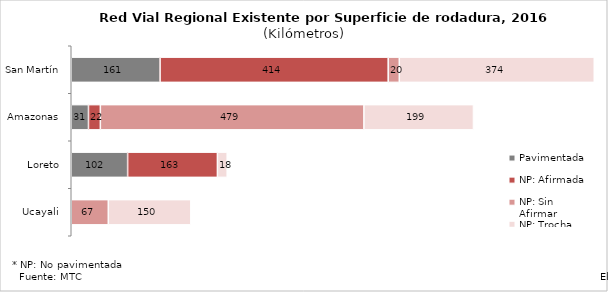
| Category | Pavimentada | NP: Afirmada | NP: Sin Afirmar | NP: Trocha |
|---|---|---|---|---|
| San Martín | 161.37 | 414.337 | 20.154 | 373.663 |
| Amazonas | 31.281 | 21.591 | 478.735 | 198.993 |
| Loreto | 102.413 | 163.087 | 0 | 17.77 |
| Ucayali | 0 | 0 | 67.293 | 149.936 |